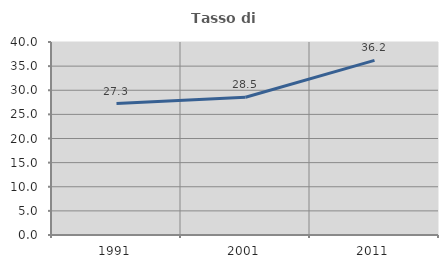
| Category | Tasso di occupazione   |
|---|---|
| 1991.0 | 27.253 |
| 2001.0 | 28.542 |
| 2011.0 | 36.201 |